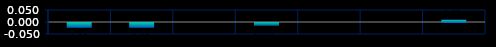
| Category | Series 0 |
|---|---|
| 0 | -0.02 |
| 1 | -0.02 |
| 2 | 0 |
| 3 | -0.01 |
| 4 | 0 |
| 5 | 0 |
| 6 | 0.01 |